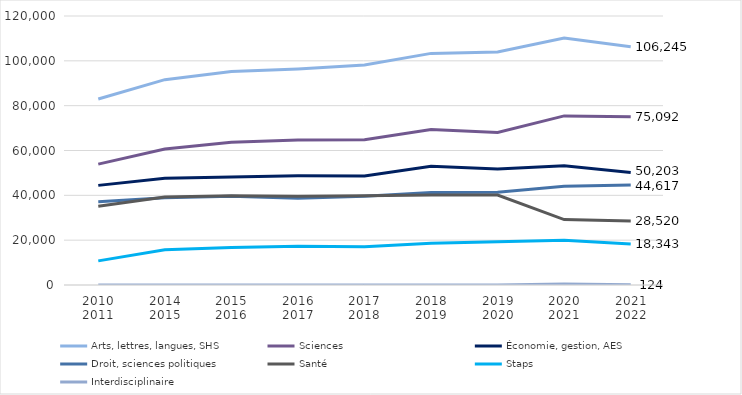
| Category | Arts, lettres, langues, SHS | Sciences | Économie, gestion, AES | Droit, sciences politiques | Santé | Staps | Interdisciplinaire |
|---|---|---|---|---|---|---|---|
| 2010
2011 | 82963 | 53937 | 44445 | 37098 | 35146 | 10759 | 0 |
| 2014
2015
 | 91598 | 60626 | 47615 | 38927 | 39237 | 15767 | 0 |
| 2015
2016 | 95235 | 63682 | 48147 | 39598 | 39773 | 16709 | 0 |
| 2016
2017 | 96382 | 64689 | 48705 | 38675 | 39646 | 17330 | 0 |
| 2017
2018 | 98160 | 64824 | 48632 | 39631 | 39797 | 17098 | 0 |
| 2018
2019 | 103319 | 69335 | 52996 | 41211 | 40193 | 18672 | 0 |
| 2019
2020
 | 103949 | 68026 | 51720 | 41347 | 40155 | 19313 | 0 |
| 2020
2021 | 110138 | 75442 | 53191 | 44028 | 29190 | 19956 | 489 |
| 2021
2022 | 106245 | 75092 | 50203 | 44617 | 28520 | 18343 | 124 |